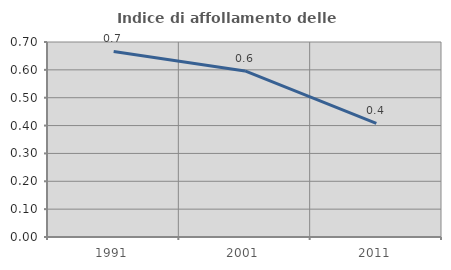
| Category | Indice di affollamento delle abitazioni  |
|---|---|
| 1991.0 | 0.666 |
| 2001.0 | 0.596 |
| 2011.0 | 0.408 |